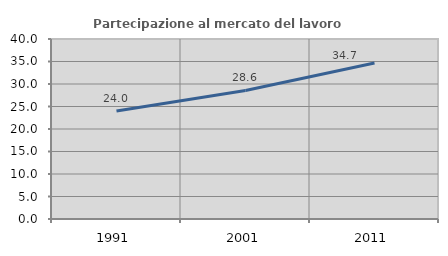
| Category | Partecipazione al mercato del lavoro  femminile |
|---|---|
| 1991.0 | 24.011 |
| 2001.0 | 28.571 |
| 2011.0 | 34.679 |